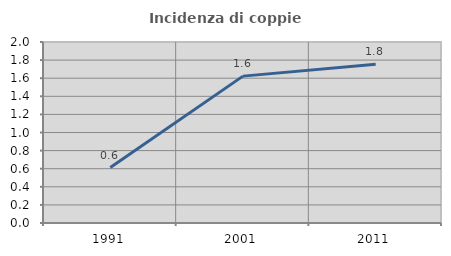
| Category | Incidenza di coppie miste |
|---|---|
| 1991.0 | 0.613 |
| 2001.0 | 1.623 |
| 2011.0 | 1.754 |